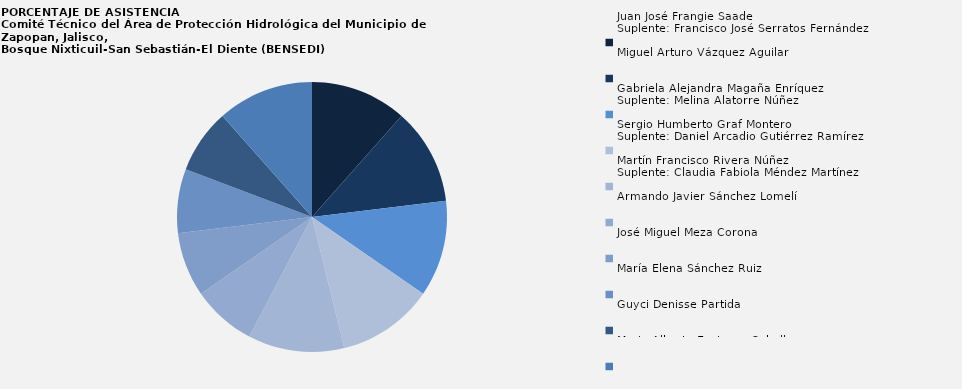
| Category | Juan José Frangie Saade
Suplente: Francisco José Serratos Fernández |
|---|---|
| Juan José Frangie Saade
Suplente: Francisco José Serratos Fernández | 3 |
| Miguel Arturo Vázquez Aguilar  | 3 |
| Gabriela Alejandra Magaña Enríquez
Suplente: Melina Alatorre Núñez | 3 |
| Sergio Humberto Graf Montero
Suplente: Daniel Arcadio Gutiérrez Ramírez | 3 |
| Martín Francisco Rivera Núñez
Suplente: Claudia Fabiola Méndez Martínez | 3 |
| Armando Javier Sánchez Lomelí  | 2 |
| José Miguel Meza Corona  | 2 |
| María Elena Sánchez Ruiz  | 2 |
| Guyci Denisse Partida  | 2 |
| Mario Alberto Espinosa Ceballos | 3 |